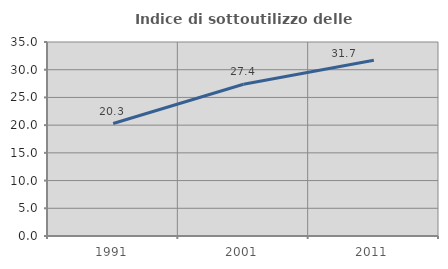
| Category | Indice di sottoutilizzo delle abitazioni  |
|---|---|
| 1991.0 | 20.292 |
| 2001.0 | 27.371 |
| 2011.0 | 31.711 |